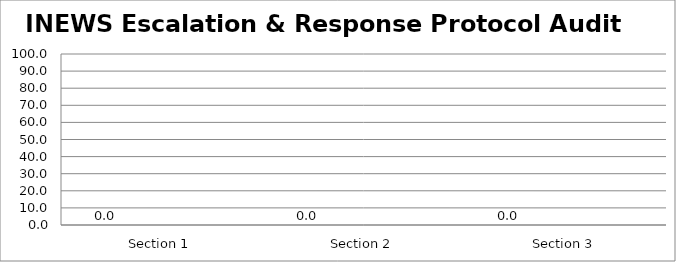
| Category | Series 0 | Series 1 | Series 2 | Series 3 |
|---|---|---|---|---|
| Section 1 | 0 |  |  |  |
| Section 2 | 0 |  |  |  |
| Section 3 | 0 |  |  |  |